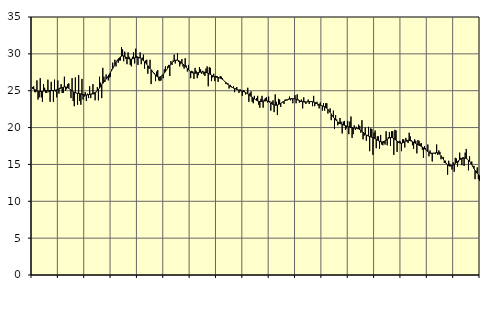
| Category | Piggar | Series 1 |
|---|---|---|
| nan | 25.5 | 25.28 |
| 87.0 | 25.6 | 25.23 |
| 87.0 | 24.8 | 25.17 |
| 87.0 | 24.8 | 25.08 |
| 87.0 | 26.4 | 25.01 |
| 87.0 | 23.8 | 24.95 |
| 87.0 | 24.1 | 24.91 |
| 87.0 | 26.7 | 24.89 |
| 87.0 | 24.1 | 24.89 |
| 87.0 | 23.5 | 24.91 |
| 87.0 | 25.9 | 24.94 |
| 87.0 | 25.4 | 24.98 |
| nan | 24.7 | 25.02 |
| 88.0 | 24.7 | 25.04 |
| 88.0 | 26.5 | 25.04 |
| 88.0 | 24.8 | 25.04 |
| 88.0 | 23.5 | 25.02 |
| 88.0 | 26.2 | 25.01 |
| 88.0 | 25.1 | 25.01 |
| 88.0 | 23.5 | 25.02 |
| 88.0 | 26.5 | 25.04 |
| 88.0 | 24.9 | 25.08 |
| 88.0 | 24.1 | 25.13 |
| 88.0 | 26.4 | 25.18 |
| nan | 24.6 | 25.24 |
| 89.0 | 25.4 | 25.3 |
| 89.0 | 25.9 | 25.36 |
| 89.0 | 24.7 | 25.43 |
| 89.0 | 24.7 | 25.48 |
| 89.0 | 26.9 | 25.52 |
| 89.0 | 25 | 25.52 |
| 89.0 | 25.2 | 25.49 |
| 89.0 | 25.9 | 25.43 |
| 89.0 | 26 | 25.33 |
| 89.0 | 25.2 | 25.22 |
| 89.0 | 24 | 25.1 |
| nan | 26.7 | 24.97 |
| 90.0 | 23.6 | 24.86 |
| 90.0 | 22.9 | 24.77 |
| 90.0 | 26.8 | 24.71 |
| 90.0 | 24.7 | 24.68 |
| 90.0 | 23.1 | 24.65 |
| 90.0 | 27.1 | 24.63 |
| 90.0 | 23.6 | 24.6 |
| 90.0 | 23.1 | 24.56 |
| 90.0 | 26.6 | 24.51 |
| 90.0 | 23.8 | 24.47 |
| 90.0 | 24.2 | 24.43 |
| nan | 24.8 | 24.41 |
| 91.0 | 23.6 | 24.41 |
| 91.0 | 24.6 | 24.44 |
| 91.0 | 24 | 24.47 |
| 91.0 | 25.6 | 24.5 |
| 91.0 | 24 | 24.54 |
| 91.0 | 24.5 | 24.58 |
| 91.0 | 25.9 | 24.62 |
| 91.0 | 24.5 | 24.68 |
| 91.0 | 23.7 | 24.76 |
| 91.0 | 24.8 | 24.85 |
| 91.0 | 25.5 | 24.98 |
| nan | 23.7 | 25.16 |
| 92.0 | 26.9 | 25.36 |
| 92.0 | 26.1 | 25.57 |
| 92.0 | 24 | 25.79 |
| 92.0 | 28.1 | 26 |
| 92.0 | 26.9 | 26.2 |
| 92.0 | 26.2 | 26.39 |
| 92.0 | 27.2 | 26.58 |
| 92.0 | 26.7 | 26.78 |
| 92.0 | 26.4 | 27 |
| 92.0 | 26.8 | 27.24 |
| 92.0 | 26.9 | 27.49 |
| nan | 27.9 | 27.75 |
| 93.0 | 28.8 | 28.01 |
| 93.0 | 28.3 | 28.28 |
| 93.0 | 29.2 | 28.55 |
| 93.0 | 28.3 | 28.82 |
| 93.0 | 29.1 | 29.06 |
| 93.0 | 28.8 | 29.27 |
| 93.0 | 29.1 | 29.45 |
| 93.0 | 29.1 | 29.59 |
| 93.0 | 30.9 | 29.68 |
| 93.0 | 30.6 | 29.72 |
| 93.0 | 29 | 29.72 |
| nan | 30.3 | 29.66 |
| 94.0 | 29.3 | 29.57 |
| 94.0 | 28.6 | 29.47 |
| 94.0 | 30.2 | 29.38 |
| 94.0 | 29.6 | 29.31 |
| 94.0 | 28.5 | 29.28 |
| 94.0 | 28.3 | 29.29 |
| 94.0 | 29.6 | 29.33 |
| 94.0 | 30.2 | 29.39 |
| 94.0 | 28.7 | 29.46 |
| 94.0 | 30.7 | 29.51 |
| 94.0 | 29.7 | 29.54 |
| nan | 28.5 | 29.54 |
| 95.0 | 29.4 | 29.51 |
| 95.0 | 30.2 | 29.44 |
| 95.0 | 28.6 | 29.34 |
| 95.0 | 29.5 | 29.21 |
| 95.0 | 29.9 | 29.07 |
| 95.0 | 28 | 28.93 |
| 95.0 | 29.1 | 28.77 |
| 95.0 | 29.2 | 28.59 |
| 95.0 | 27.3 | 28.4 |
| 95.0 | 28 | 28.21 |
| 95.0 | 29.2 | 28.02 |
| nan | 25.9 | 27.84 |
| 96.0 | 27.7 | 27.66 |
| 96.0 | 27.4 | 27.47 |
| 96.0 | 27.4 | 27.29 |
| 96.0 | 26.3 | 27.12 |
| 96.0 | 27.6 | 26.98 |
| 96.0 | 27.8 | 26.88 |
| 96.0 | 26.4 | 26.84 |
| 96.0 | 26.3 | 26.86 |
| 96.0 | 26.4 | 26.93 |
| 96.0 | 27.1 | 27.06 |
| 96.0 | 26.7 | 27.22 |
| nan | 27.9 | 27.4 |
| 97.0 | 28.3 | 27.6 |
| 97.0 | 27.8 | 27.81 |
| 97.0 | 28.3 | 28.03 |
| 97.0 | 28.5 | 28.25 |
| 97.0 | 27 | 28.45 |
| 97.0 | 29 | 28.64 |
| 97.0 | 28.5 | 28.8 |
| 97.0 | 29.1 | 28.94 |
| 97.0 | 29.9 | 29.05 |
| 97.0 | 28.7 | 29.13 |
| 97.0 | 29.1 | 29.16 |
| nan | 30.1 | 29.15 |
| 98.0 | 28.9 | 29.09 |
| 98.0 | 28.3 | 29 |
| 98.0 | 28.6 | 28.89 |
| 98.0 | 29.3 | 28.76 |
| 98.0 | 28.3 | 28.61 |
| 98.0 | 28 | 28.47 |
| 98.0 | 29.4 | 28.32 |
| 98.0 | 28.4 | 28.16 |
| 98.0 | 27.6 | 28.01 |
| 98.0 | 28.5 | 27.85 |
| 98.0 | 27.7 | 27.7 |
| nan | 26.7 | 27.57 |
| 99.0 | 27.7 | 27.46 |
| 99.0 | 27.6 | 27.4 |
| 99.0 | 26.6 | 27.37 |
| 99.0 | 28.1 | 27.37 |
| 99.0 | 27.7 | 27.39 |
| 99.0 | 26.7 | 27.43 |
| 99.0 | 27.1 | 27.47 |
| 99.0 | 28.2 | 27.5 |
| 99.0 | 27.9 | 27.52 |
| 99.0 | 27.3 | 27.54 |
| 99.0 | 27.7 | 27.54 |
| nan | 27.2 | 27.53 |
| 0.0 | 27 | 27.51 |
| 0.0 | 28 | 27.47 |
| 0.0 | 28.3 | 27.42 |
| 0.0 | 25.6 | 27.36 |
| 0.0 | 28.2 | 27.28 |
| 0.0 | 28.1 | 27.2 |
| 0.0 | 26.3 | 27.12 |
| 0.0 | 26.8 | 27.03 |
| 0.0 | 27.3 | 26.96 |
| 0.0 | 26.3 | 26.9 |
| 0.0 | 27 | 26.85 |
| nan | 27 | 26.82 |
| 1.0 | 26.2 | 26.79 |
| 1.0 | 26.8 | 26.75 |
| 1.0 | 27 | 26.7 |
| 1.0 | 26.9 | 26.63 |
| 1.0 | 26.7 | 26.54 |
| 1.0 | 26.4 | 26.42 |
| 1.0 | 26.3 | 26.28 |
| 1.0 | 25.9 | 26.13 |
| 1.0 | 25.9 | 25.98 |
| 1.0 | 26 | 25.84 |
| 1.0 | 25.3 | 25.71 |
| nan | 25.8 | 25.59 |
| 2.0 | 25.6 | 25.5 |
| 2.0 | 25.4 | 25.43 |
| 2.0 | 25.6 | 25.36 |
| 2.0 | 24.8 | 25.3 |
| 2.0 | 25.3 | 25.23 |
| 2.0 | 25.5 | 25.17 |
| 2.0 | 25.1 | 25.12 |
| 2.0 | 24.7 | 25.06 |
| 2.0 | 25.2 | 25.01 |
| 2.0 | 25.1 | 24.97 |
| 2.0 | 24.3 | 24.93 |
| nan | 25.1 | 24.88 |
| 3.0 | 25 | 24.83 |
| 3.0 | 24.5 | 24.75 |
| 3.0 | 24.7 | 24.66 |
| 3.0 | 25.4 | 24.57 |
| 3.0 | 23.5 | 24.46 |
| 3.0 | 24.7 | 24.35 |
| 3.0 | 24.9 | 24.24 |
| 3.0 | 23.5 | 24.12 |
| 3.0 | 23.3 | 24.01 |
| 3.0 | 24.3 | 23.89 |
| 3.0 | 23.8 | 23.79 |
| nan | 24 | 23.69 |
| 4.0 | 24.3 | 23.61 |
| 4.0 | 23.1 | 23.56 |
| 4.0 | 22.7 | 23.53 |
| 4.0 | 23.9 | 23.53 |
| 4.0 | 24.3 | 23.55 |
| 4.0 | 22.7 | 23.58 |
| 4.0 | 23.8 | 23.6 |
| 4.0 | 24 | 23.62 |
| 4.0 | 24.1 | 23.63 |
| 4.0 | 23.4 | 23.6 |
| 4.0 | 24.2 | 23.53 |
| nan | 23.6 | 23.44 |
| 5.0 | 22.3 | 23.33 |
| 5.0 | 23.5 | 23.22 |
| 5.0 | 23.7 | 23.13 |
| 5.0 | 22.1 | 23.07 |
| 5.0 | 24.5 | 23.03 |
| 5.0 | 23.5 | 23.04 |
| 5.0 | 21.7 | 23.07 |
| 5.0 | 23.9 | 23.12 |
| 5.0 | 23.8 | 23.2 |
| 5.0 | 22.8 | 23.28 |
| 5.0 | 23.4 | 23.37 |
| nan | 23.5 | 23.46 |
| 6.0 | 23.2 | 23.55 |
| 6.0 | 23.8 | 23.64 |
| 6.0 | 23.8 | 23.71 |
| 6.0 | 23.7 | 23.77 |
| 6.0 | 23.9 | 23.82 |
| 6.0 | 24.2 | 23.86 |
| 6.0 | 23.7 | 23.9 |
| 6.0 | 24 | 23.92 |
| 6.0 | 23.3 | 23.92 |
| 6.0 | 23.9 | 23.9 |
| 6.0 | 24.4 | 23.87 |
| nan | 23.3 | 23.83 |
| 7.0 | 24.5 | 23.78 |
| 7.0 | 23.8 | 23.72 |
| 7.0 | 23.4 | 23.66 |
| 7.0 | 23.5 | 23.61 |
| 7.0 | 23.8 | 23.56 |
| 7.0 | 22.6 | 23.51 |
| 7.0 | 24.1 | 23.48 |
| 7.0 | 23.6 | 23.46 |
| 7.0 | 23.2 | 23.46 |
| 7.0 | 23.5 | 23.48 |
| 7.0 | 23.8 | 23.5 |
| nan | 23.2 | 23.52 |
| 8.0 | 23.6 | 23.53 |
| 8.0 | 23.6 | 23.52 |
| 8.0 | 22.9 | 23.51 |
| 8.0 | 24.3 | 23.47 |
| 8.0 | 22.9 | 23.41 |
| 8.0 | 23.2 | 23.34 |
| 8.0 | 23.5 | 23.26 |
| 8.0 | 23 | 23.18 |
| 8.0 | 22.6 | 23.11 |
| 8.0 | 23.4 | 23.04 |
| 8.0 | 23 | 22.99 |
| nan | 22.3 | 22.94 |
| 9.0 | 23.3 | 22.89 |
| 9.0 | 22.3 | 22.83 |
| 9.0 | 23.3 | 22.74 |
| 9.0 | 23.3 | 22.63 |
| 9.0 | 21.9 | 22.48 |
| 9.0 | 22.3 | 22.29 |
| 9.0 | 22.6 | 22.07 |
| 9.0 | 21 | 21.85 |
| 9.0 | 21.7 | 21.62 |
| 9.0 | 22.3 | 21.41 |
| 9.0 | 19.8 | 21.21 |
| nan | 21.7 | 21.04 |
| 10.0 | 21.1 | 20.89 |
| 10.0 | 20.3 | 20.77 |
| 10.0 | 20.5 | 20.66 |
| 10.0 | 21.3 | 20.56 |
| 10.0 | 20.8 | 20.48 |
| 10.0 | 19.2 | 20.42 |
| 10.0 | 20.8 | 20.36 |
| 10.0 | 20.9 | 20.31 |
| 10.0 | 19.7 | 20.26 |
| 10.0 | 19.9 | 20.2 |
| 10.0 | 20.9 | 20.14 |
| nan | 19.1 | 20.09 |
| 11.0 | 20.8 | 20.03 |
| 11.0 | 21.5 | 19.99 |
| 11.0 | 18.6 | 19.97 |
| 11.0 | 19.1 | 19.95 |
| 11.0 | 20.3 | 19.94 |
| 11.0 | 19.7 | 19.93 |
| 11.0 | 20.1 | 19.91 |
| 11.0 | 19.8 | 19.87 |
| 11.0 | 20.4 | 19.81 |
| 11.0 | 20.2 | 19.73 |
| 11.0 | 19.3 | 19.63 |
| nan | 21 | 19.51 |
| 12.0 | 18.4 | 19.37 |
| 12.0 | 18.9 | 19.23 |
| 12.0 | 20 | 19.1 |
| 12.0 | 18.2 | 18.99 |
| 12.0 | 19 | 18.91 |
| 12.0 | 20.1 | 18.84 |
| 12.0 | 16.8 | 18.79 |
| 12.0 | 19.9 | 18.74 |
| 12.0 | 19.8 | 18.69 |
| 12.0 | 16.3 | 18.63 |
| 12.0 | 19.3 | 18.56 |
| nan | 19.6 | 18.48 |
| 13.0 | 17.2 | 18.39 |
| 13.0 | 18.8 | 18.3 |
| 13.0 | 18.8 | 18.21 |
| 13.0 | 17.1 | 18.14 |
| 13.0 | 19 | 18.08 |
| 13.0 | 17.7 | 18.06 |
| 13.0 | 17.6 | 18.07 |
| 13.0 | 17.9 | 18.12 |
| 13.0 | 17.7 | 18.19 |
| 13.0 | 19.5 | 18.29 |
| 13.0 | 17.6 | 18.4 |
| nan | 18.7 | 18.51 |
| 14.0 | 19.4 | 18.59 |
| 14.0 | 17.5 | 18.65 |
| 14.0 | 19.5 | 18.65 |
| 14.0 | 19.5 | 18.61 |
| 14.0 | 16.3 | 18.53 |
| 14.0 | 19.7 | 18.42 |
| 14.0 | 19.6 | 18.3 |
| 14.0 | 16.7 | 18.17 |
| 14.0 | 17.9 | 18.05 |
| 14.0 | 18.2 | 17.95 |
| 14.0 | 18.1 | 17.89 |
| nan | 16.8 | 17.89 |
| 15.0 | 18.4 | 17.92 |
| 15.0 | 18.4 | 17.99 |
| 15.0 | 17.3 | 18.09 |
| 15.0 | 18.6 | 18.17 |
| 15.0 | 18.1 | 18.24 |
| 15.0 | 17.9 | 18.28 |
| 15.0 | 19.3 | 18.27 |
| 15.0 | 18.8 | 18.22 |
| 15.0 | 18.3 | 18.17 |
| 15.0 | 17.6 | 18.09 |
| 15.0 | 17.1 | 18.01 |
| nan | 18.4 | 17.93 |
| 16.0 | 18.2 | 17.85 |
| 16.0 | 16.5 | 17.76 |
| 16.0 | 18.3 | 17.68 |
| 16.0 | 18.2 | 17.6 |
| 16.0 | 17.8 | 17.53 |
| 16.0 | 17.9 | 17.45 |
| 16.0 | 17 | 17.36 |
| 16.0 | 15.9 | 17.24 |
| 16.0 | 17.5 | 17.11 |
| 16.0 | 17.2 | 16.98 |
| 16.0 | 16.9 | 16.85 |
| nan | 17.7 | 16.73 |
| 17.0 | 16.1 | 16.63 |
| 17.0 | 16.9 | 16.56 |
| 17.0 | 16.4 | 16.53 |
| 17.0 | 15.4 | 16.52 |
| 17.0 | 16.5 | 16.53 |
| 17.0 | 16.5 | 16.55 |
| 17.0 | 16.4 | 16.57 |
| 17.0 | 17.7 | 16.59 |
| 17.0 | 16.3 | 16.57 |
| 17.0 | 16.9 | 16.5 |
| 17.0 | 16.7 | 16.37 |
| nan | 15.7 | 16.19 |
| 18.0 | 16 | 15.97 |
| 18.0 | 16 | 15.73 |
| 18.0 | 15.2 | 15.48 |
| 18.0 | 15.5 | 15.25 |
| 18.0 | 15.2 | 15.07 |
| 18.0 | 13.6 | 14.93 |
| 18.0 | 15.5 | 14.83 |
| 18.0 | 15.1 | 14.78 |
| 18.0 | 14.9 | 14.78 |
| 18.0 | 14.3 | 14.83 |
| 18.0 | 15.3 | 14.92 |
| nan | 14 | 15.03 |
| 19.0 | 15.9 | 15.14 |
| 19.0 | 15.8 | 15.26 |
| 19.0 | 14.7 | 15.39 |
| 19.0 | 15.3 | 15.51 |
| 19.0 | 16.6 | 15.62 |
| 19.0 | 15.9 | 15.71 |
| 19.0 | 14.9 | 15.79 |
| 19.0 | 16 | 15.84 |
| 19.0 | 14.8 | 15.86 |
| 19.0 | 16.6 | 15.85 |
| 19.0 | 17.1 | 15.8 |
| nan | 15.7 | 15.72 |
| 20.0 | 14.2 | 15.6 |
| 20.0 | 16.1 | 15.42 |
| 20.0 | 15.1 | 15.21 |
| 20.0 | 15.4 | 14.97 |
| 20.0 | 14.8 | 14.71 |
| 20.0 | 14.8 | 14.44 |
| 20.0 | 13 | 14.19 |
| 20.0 | 14.1 | 13.97 |
| 20.0 | 14.6 | 13.78 |
| 20.0 | 13 | 13.63 |
| 20.0 | 12.8 | 13.5 |